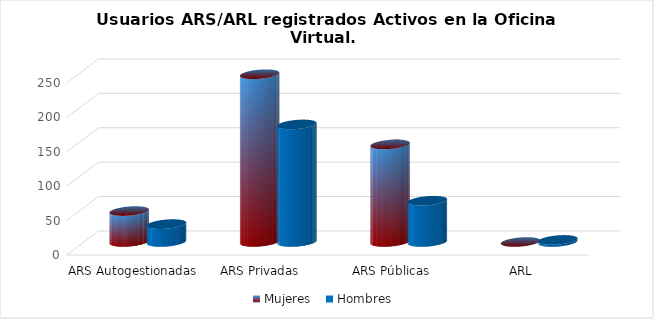
| Category | Mujeres | Hombres |
|---|---|---|
| ARS Autogestionadas | 45 | 26 |
| ARS Privadas | 244 | 171 |
| ARS Públicas | 142 | 60 |
| ARL | 0 | 3 |